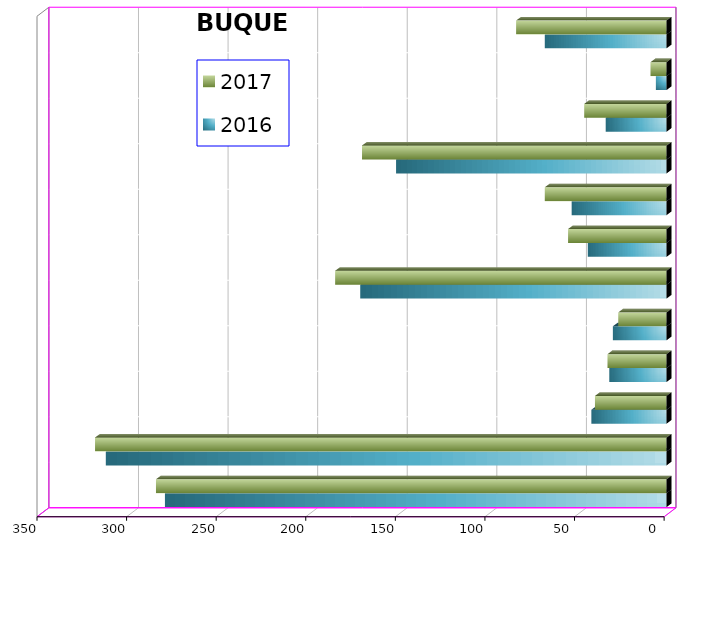
| Category | 2016 | 2017 |
|---|---|---|
| ICAVE | 280 | 285 |
| CICE | 313 | 319 |
| T. C. E. | 42 | 40 |
| CARGILL | 32 | 33 |
| TMV | 30 | 27 |
| SSA | 171 | 185 |
| SEPSA | 44 | 55 |
| VOPAK | 53 | 68 |
| CPV | 151 | 170 |
| EXCELLENCE | 34 | 46 |
| SIP | 6 | 9 |
| PEMEX | 68 | 84 |